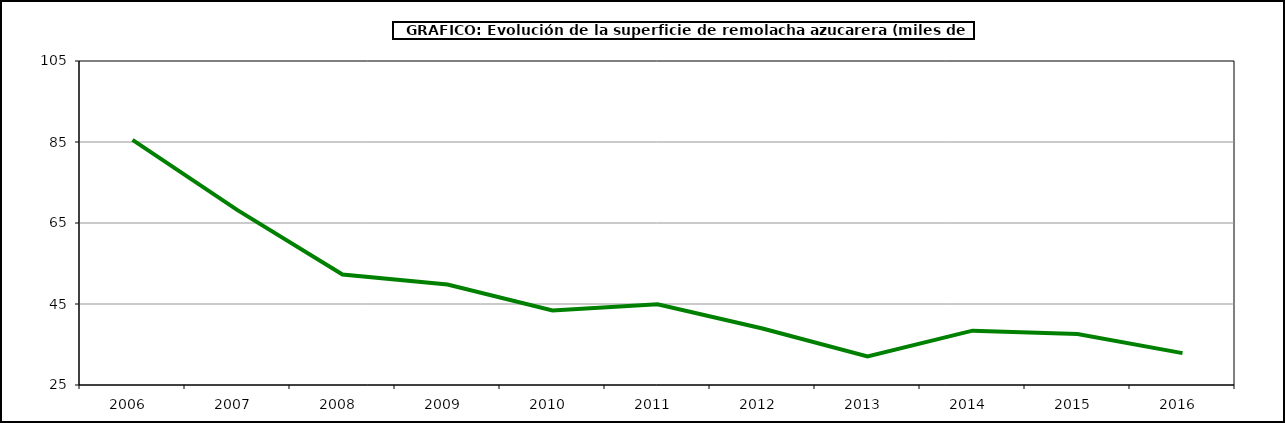
| Category | Superficie |
|---|---|
| 2006.0 | 85.516 |
| 2007.0 | 68.171 |
| 2008.0 | 52.289 |
| 2009.0 | 49.813 |
| 2010.0 | 43.382 |
| 2011.0 | 44.931 |
| 2012.0 | 38.952 |
| 2013.0 | 32.052 |
| 2014.0 | 38.414 |
| 2015.0 | 37.605 |
| 2016.0 | 32.874 |